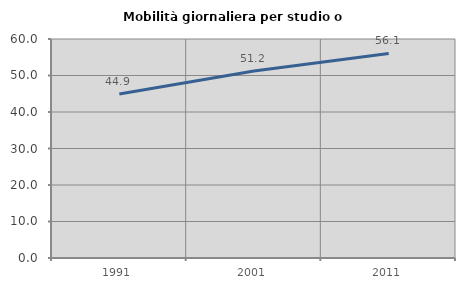
| Category | Mobilità giornaliera per studio o lavoro |
|---|---|
| 1991.0 | 44.933 |
| 2001.0 | 51.23 |
| 2011.0 | 56.054 |